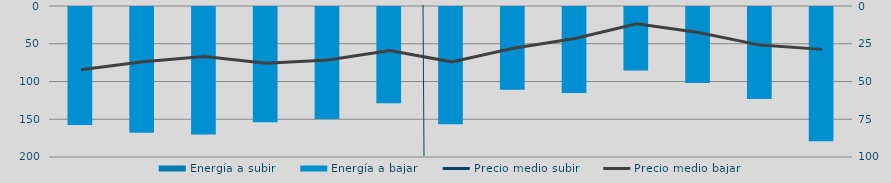
| Category | Energía a subir | Energía a bajar |
|---|---|---|
| D |  | 157.467 |
| E |  | 167.866 |
| F |  | 170.333 |
| M |  | 153.818 |
| A |  | 149.517 |
| M |  | 128.775 |
| J |  | 156.615 |
| J |  | 110.92 |
| A |  | 115.196 |
| S |  | 85.375 |
| O |  | 101.923 |
| N |  | 123.137 |
| D |  | 178.975 |